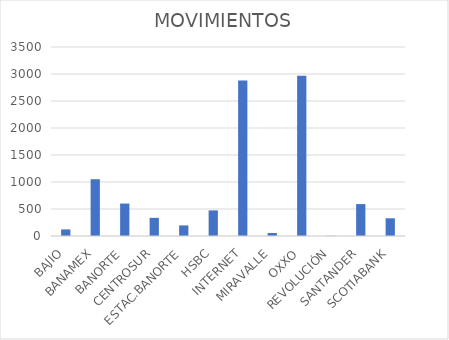
| Category | MOVIMIENTOS |
|---|---|
| BAJIO | 122 |
| BANAMEX | 1051 |
| BANORTE | 601 |
| CENTROSUR | 336 |
| ESTAC.BANORTE | 196 |
| HSBC | 474 |
| INTERNET | 2878 |
| MIRAVALLE | 56 |
| OXXO | 2966 |
| REVOLUCIÓN | 4 |
| SANTANDER | 591 |
| SCOTIABANK | 328 |